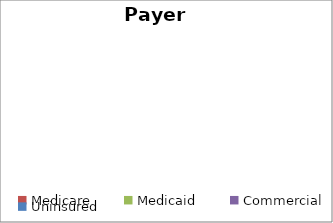
| Category | Series 0 |
|---|---|
| Medicare | 0 |
| Medicaid  | 0 |
| Commercial | 0 |
| Uninsured | 0 |